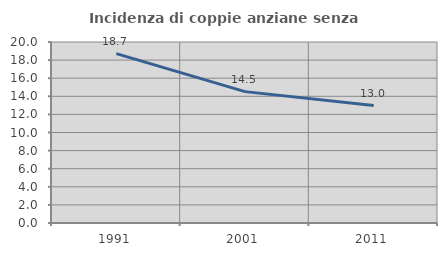
| Category | Incidenza di coppie anziane senza figli  |
|---|---|
| 1991.0 | 18.713 |
| 2001.0 | 14.516 |
| 2011.0 | 12.973 |